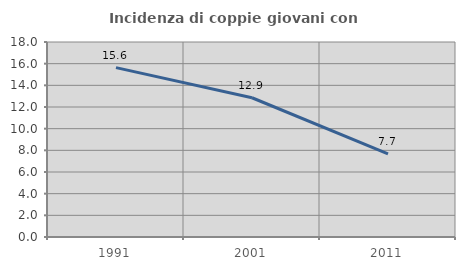
| Category | Incidenza di coppie giovani con figli |
|---|---|
| 1991.0 | 15.633 |
| 2001.0 | 12.854 |
| 2011.0 | 7.677 |